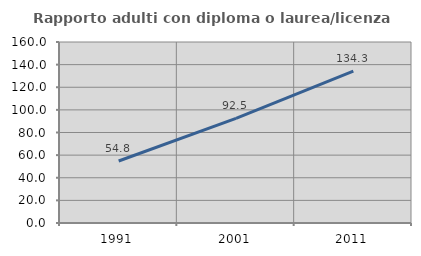
| Category | Rapporto adulti con diploma o laurea/licenza media  |
|---|---|
| 1991.0 | 54.808 |
| 2001.0 | 92.521 |
| 2011.0 | 134.324 |